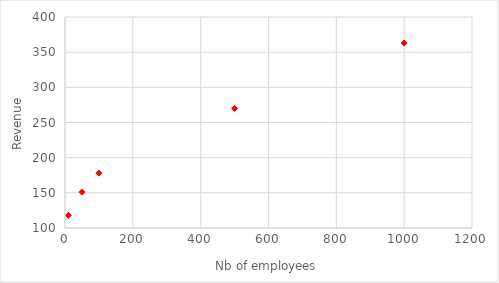
| Category | Series 0 |
|---|---|
| 10.0 | 118 |
| 50.0 | 151 |
| 100.0 | 178 |
| 500.0 | 270 |
| 1000.0 | 363 |